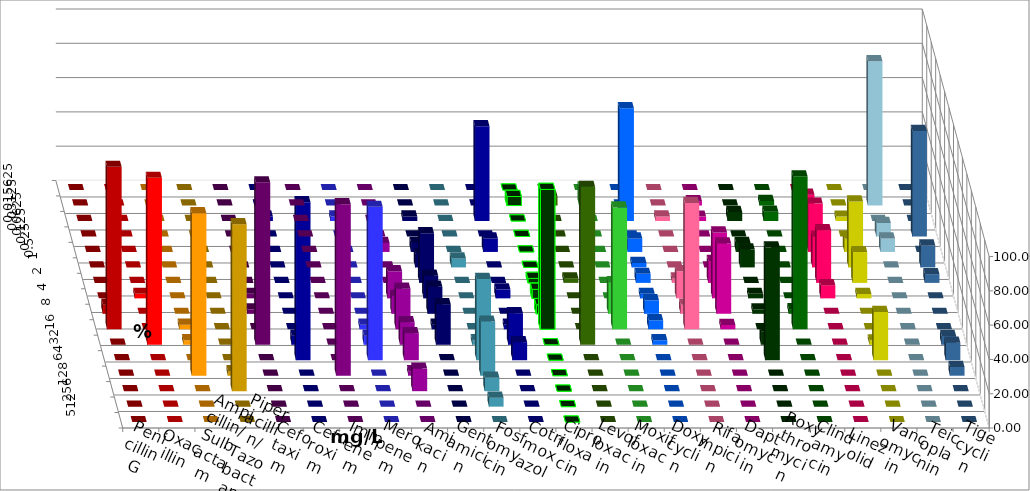
| Category | Penicillin G | Oxacillin | Ampicillin/ Sulbactam | Piperacillin/ Tazobactam | Cefotaxim | Cefuroxim | Imipenem | Meropenem | Amikacin | Gentamicin | Fosfomycin | Cotrimoxazol | Ciprofloxacin | Levofloxacin | Moxifloxacin | Doxycyclin | Rifampicin | Daptomycin | Roxythromycin | Clindamycin | Linezolid | Vancomycin | Teicoplanin | Tigecyclin |
|---|---|---|---|---|---|---|---|---|---|---|---|---|---|---|---|---|---|---|---|---|---|---|---|---|
| 0.015625 | 0 | 0 | 0 | 0 | 0 | 0 | 0 | 0 | 0 | 0 | 0 | 0 | 0 | 0 | 0 | 0 | 0 | 0 | 0 | 0 | 0 | 0 | 0 | 0 |
| 0.03125 | 0 | 0 | 0 | 0 | 0 | 0 | 0 | 0 | 0 | 0 | 0 | 0 | 5.263 | 5.263 | 10.526 | 0 | 0 | 2.564 | 0 | 2.703 | 0 | 0 | 0 | 84.211 |
| 0.0625 | 0 | 0 | 0 | 0 | 0 | 0 | 2.632 | 2.632 | 0 | 2.632 | 0 | 55.263 | 0 | 0 | 0 | 65.789 | 2.632 | 2.564 | 5.263 | 5.405 | 15.385 | 2.564 | 0 | 0 |
| 0.125 | 0 | 0 | 0 | 0 | 0 | 0 | 0 | 0 | 0 | 0 | 0 | 0 | 0 | 0 | 0 | 0 | 0 | 0 | 0 | 0 | 0 | 0 | 61.538 | 7.895 |
| 0.25 | 0 | 0 | 0 | 0 | 0 | 0 | 0 | 0 | 5.263 | 5.263 | 0 | 7.895 | 0 | 0 | 0 | 7.895 | 0 | 0 | 5.263 | 0 | 28.205 | 7.692 | 0 | 7.895 |
| 0.5 | 0 | 0 | 0 | 0 | 0 | 0 | 0 | 0 | 0 | 7.895 | 5.263 | 0 | 0 | 0 | 0 | 2.632 | 0 | 0 | 10.526 | 0 | 17.949 | 38.462 | 12.821 | 0 |
| 1.0 | 0 | 0 | 0 | 0 | 0 | 0 | 0 | 0 | 0 | 28.947 | 0 | 0 | 2.632 | 2.632 | 0 | 5.263 | 2.632 | 12.821 | 0 | 0 | 30.769 | 17.949 | 5.128 | 0 |
| 2.0 | 0 | 2.632 | 0 | 0 | 2.632 | 0 | 0 | 0 | 15.789 | 13.158 | 0 | 5.263 | 5.263 | 0 | 0 | 2.632 | 15.789 | 38.462 | 2.632 | 0 | 7.692 | 2.564 | 0 | 0 |
| 4.0 | 5.263 | 0 | 0 | 0 | 2.632 | 0 | 0 | 0 | 10.526 | 15.789 | 0 | 0 | 5.263 | 0 | 18.421 | 7.895 | 5.263 | 41.026 | 2.632 | 2.703 | 0 | 0 | 0 | 0 |
| 8.0 | 94.737 | 0 | 2.632 | 0 | 0 | 0 | 0 | 2.632 | 23.684 | 2.632 | 0 | 2.632 | 81.579 | 0 | 71.053 | 5.263 | 73.684 | 2.564 | 0 | 89.189 | 0 | 0 | 0 | 0 |
| 16.0 | 0 | 97.368 | 2.632 | 0 | 94.737 | 0 | 5.263 | 5.263 | 13.158 | 23.684 | 2.632 | 18.421 | 0 | 92.105 | 0 | 2.632 | 0 | 0 | 7.895 | 0 | 0 | 2.564 | 5.128 | 0 |
| 32.0 | 0 | 0 | 0 | 0 | 0 | 0 | 92.105 | 89.474 | 15.789 | 0 | 47.368 | 10.526 | 0 | 0 | 0 | 0 | 0 | 0 | 65.789 | 0 | 0 | 28.205 | 10.256 | 0 |
| 64.0 | 0 | 0 | 94.737 | 2.632 | 0 | 100 | 0 | 0 | 2.632 | 0 | 31.579 | 0 | 0 | 0 | 0 | 0 | 0 | 0 | 0 | 0 | 0 | 0 | 5.128 | 0 |
| 128.0 | 0 | 0 | 0 | 97.368 | 0 | 0 | 0 | 0 | 13.158 | 0 | 7.895 | 0 | 0 | 0 | 0 | 0 | 0 | 0 | 0 | 0 | 0 | 0 | 0 | 0 |
| 256.0 | 0 | 0 | 0 | 0 | 0 | 0 | 0 | 0 | 0 | 0 | 5.263 | 0 | 0 | 0 | 0 | 0 | 0 | 0 | 0 | 0 | 0 | 0 | 0 | 0 |
| 512.0 | 0 | 0 | 0 | 0 | 0 | 0 | 0 | 0 | 0 | 0 | 0 | 0 | 0 | 0 | 0 | 0 | 0 | 0 | 0 | 0 | 0 | 0 | 0 | 0 |